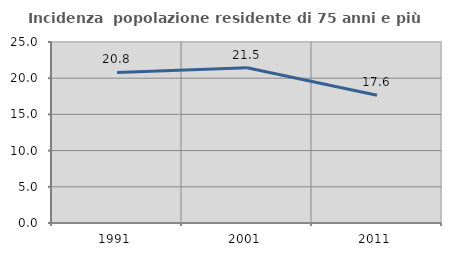
| Category | Incidenza  popolazione residente di 75 anni e più |
|---|---|
| 1991.0 | 20.798 |
| 2001.0 | 21.451 |
| 2011.0 | 17.647 |